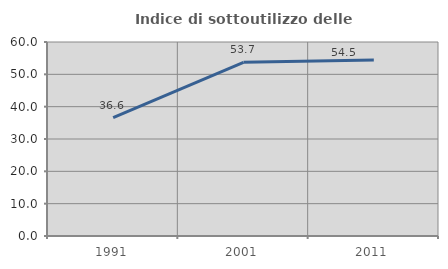
| Category | Indice di sottoutilizzo delle abitazioni  |
|---|---|
| 1991.0 | 36.623 |
| 2001.0 | 53.699 |
| 2011.0 | 54.467 |